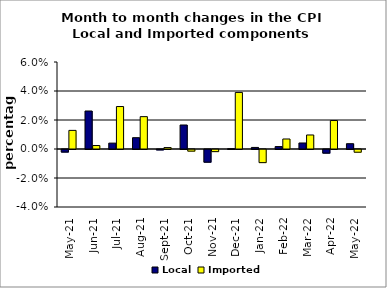
| Category | Local | Imported |
|---|---|---|
| 2021-05-01 | -0.002 | 0.013 |
| 2021-06-01 | 0.026 | 0.002 |
| 2021-07-01 | 0.004 | 0.029 |
| 2021-08-01 | 0.008 | 0.022 |
| 2021-09-01 | 0 | 0.001 |
| 2021-10-01 | 0.017 | -0.001 |
| 2021-11-01 | -0.009 | -0.001 |
| 2021-12-01 | 0 | 0.039 |
| 2022-01-01 | 0.001 | -0.009 |
| 2022-02-01 | 0.002 | 0.007 |
| 2022-03-01 | 0.004 | 0.01 |
| 2022-04-01 | -0.003 | 0.02 |
| 2022-05-01 | 0.004 | -0.002 |